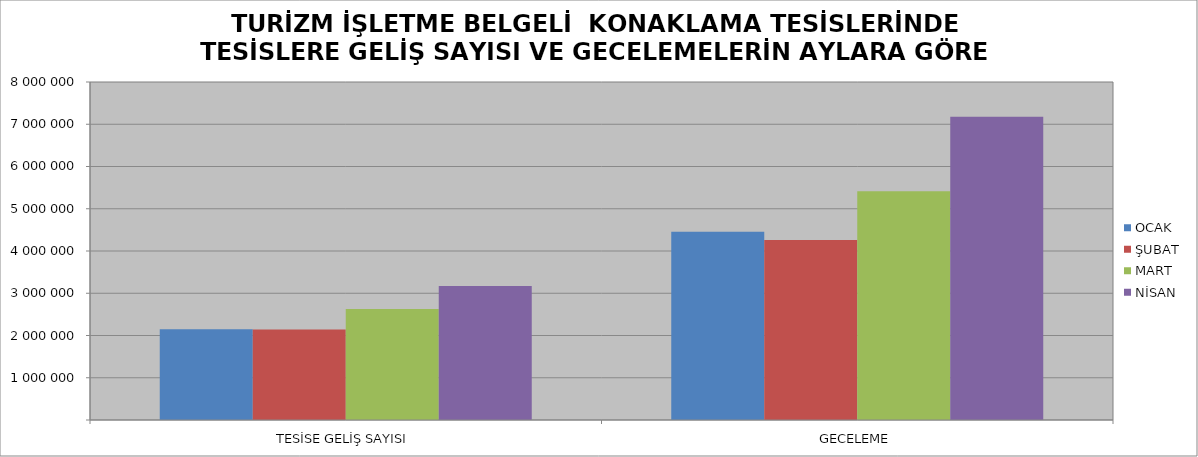
| Category | OCAK | ŞUBAT | MART | NİSAN |
|---|---|---|---|---|
| TESİSE GELİŞ SAYISI | 2146994 | 2141043 | 2629734 | 3173381 |
| GECELEME | 4457352 | 4260377 | 5413903 | 7176325 |